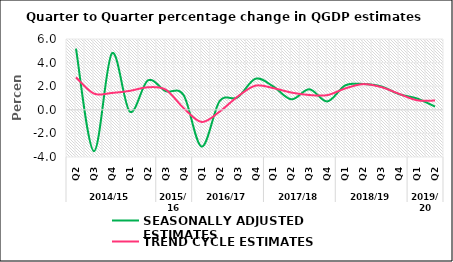
| Category | SEASONALLY ADJUSTED ESTIMATES | TREND CYCLE ESTIMATES |
|---|---|---|
| 0 | 5.188 | 2.753 |
| 1 | -3.504 | 1.373 |
| 2 | 4.782 | 1.428 |
| 3 | -0.155 | 1.605 |
| 4 | 2.485 | 1.907 |
| 5 | 1.582 | 1.707 |
| 6 | 1.231 | 0.135 |
| 7 | -3.118 | -1.029 |
| 8 | 0.73 | -0.155 |
| 9 | 1.047 | 1.114 |
| 10 | 2.633 | 2.047 |
| 11 | 1.969 | 1.834 |
| 12 | 0.887 | 1.46 |
| 13 | 1.74 | 1.252 |
| 14 | 0.712 | 1.244 |
| 15 | 2.069 | 1.81 |
| 16 | 2.187 | 2.177 |
| 17 | 1.981 | 1.926 |
| 18 | 1.322 | 1.352 |
| 19 | 0.957 | 0.805 |
| 20 | 0.273 | 0.784 |